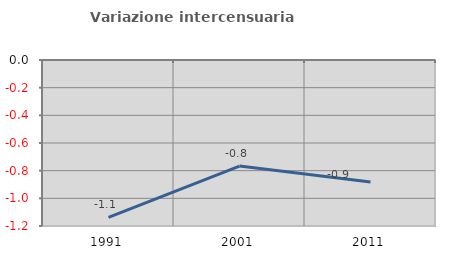
| Category | Variazione intercensuaria annua |
|---|---|
| 1991.0 | -1.137 |
| 2001.0 | -0.767 |
| 2011.0 | -0.882 |